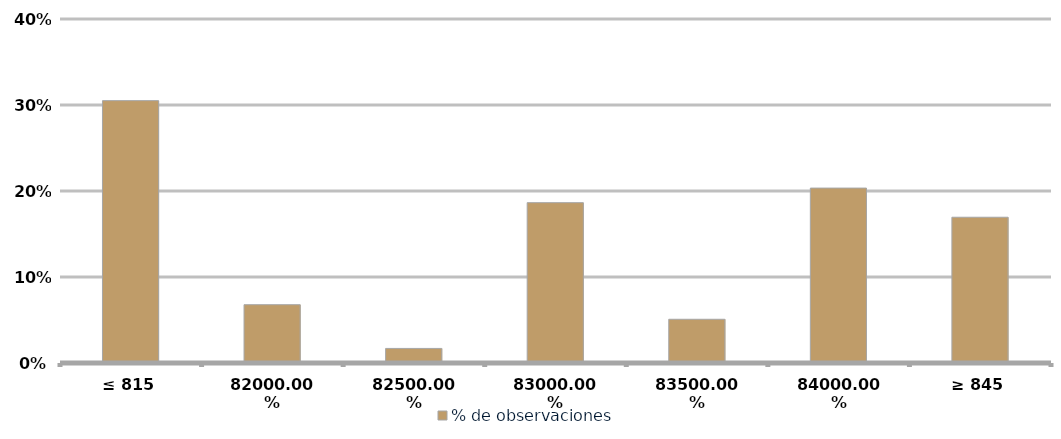
| Category | % de observaciones  |
|---|---|
| ≤ 815 | 0.305 |
| 820 | 0.068 |
| 825 | 0.017 |
| 830 | 0.186 |
| 835 | 0.051 |
| 840 | 0.203 |
| ≥ 845 | 0.169 |